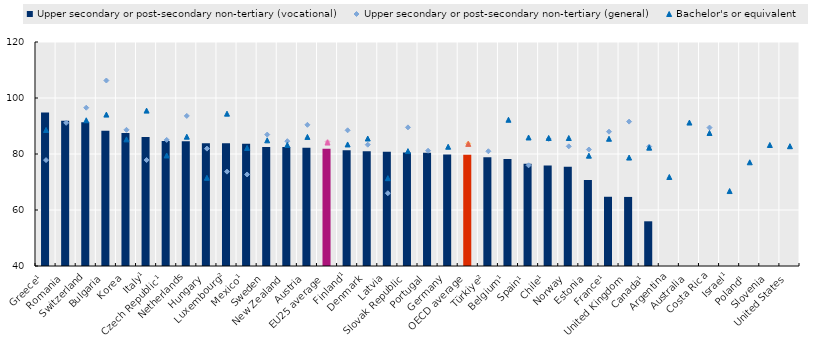
| Category | Upper secondary or post-secondary non-tertiary (vocational) |
|---|---|
| Greece¹ | 94.837 |
| Romania | 91.913 |
| Switzerland | 91.315 |
| Bulgaria | 88.299 |
| Korea | 87.491 |
| Italy¹ | 86.069 |
| Czech Republic¹ | 84.63 |
| Netherlands | 84.565 |
| Hungary | 83.866 |
| Luxembourg² | 83.854 |
| Mexico¹ | 83.697 |
| Sweden | 82.535 |
| New Zealand | 82.517 |
| Austria | 82.192 |
| EU25 average | 81.837 |
| Finland¹ | 81.298 |
| Denmark | 80.953 |
| Latvia | 80.837 |
| Slovak Republic | 80.498 |
| Portugal | 80.455 |
| Germany | 79.792 |
| OECD average | 79.72 |
| Türkiye² | 78.877 |
| Belgium¹ | 78.178 |
| Spain¹ | 76.48 |
| Chile¹ | 75.929 |
| Norway | 75.467 |
| Estonia | 70.753 |
| France¹ | 64.727 |
| United Kingdom | 64.667 |
| Canada¹ | 55.964 |
| Argentina | 0 |
| Australia | 0 |
| Costa Rica | 0 |
| Israel¹ | 0 |
| Poland¹ | 0 |
| Slovenia | 0 |
| United States | 0 |